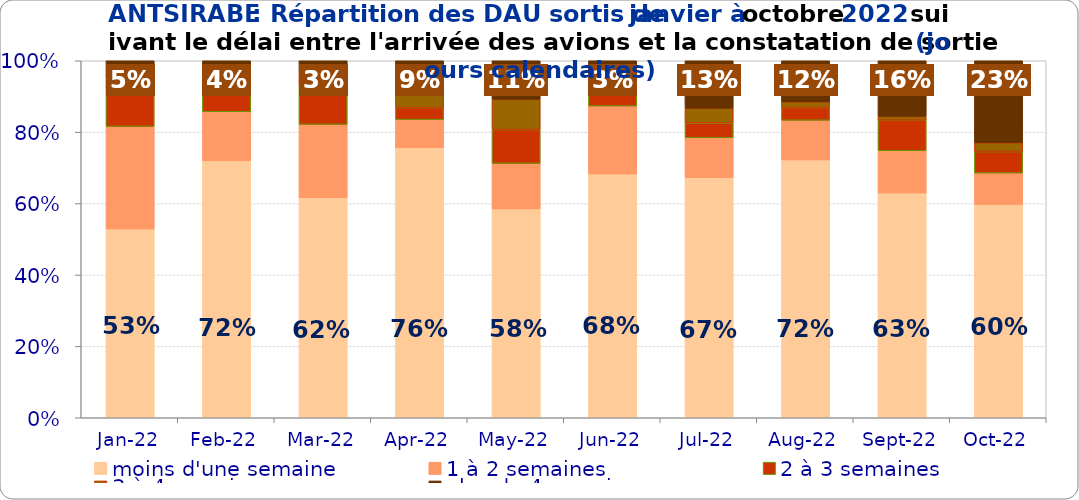
| Category | moins d'une semaine | 1 à 2 semaines | 2 à 3 semaines | 3 à 4 semaines | plus de 4 semaines |
|---|---|---|---|---|---|
| 2022-01-01 | 0.529 | 0.287 | 0.103 | 0.029 | 0.052 |
| 2022-02-01 | 0.72 | 0.137 | 0.104 | 0 | 0.038 |
| 2022-03-01 | 0.616 | 0.205 | 0.109 | 0.035 | 0.035 |
| 2022-04-01 | 0.757 | 0.079 | 0.034 | 0.041 | 0.09 |
| 2022-05-01 | 0.585 | 0.127 | 0.095 | 0.085 | 0.108 |
| 2022-06-01 | 0.683 | 0.19 | 0.034 | 0.06 | 0.034 |
| 2022-07-01 | 0.672 | 0.112 | 0.041 | 0.041 | 0.133 |
| 2022-08-01 | 0.722 | 0.111 | 0.036 | 0.016 | 0.115 |
| 2022-09-01 | 0.63 | 0.119 | 0.085 | 0.011 | 0.156 |
| 2022-10-01 | 0.597 | 0.088 | 0.06 | 0.025 | 0.23 |